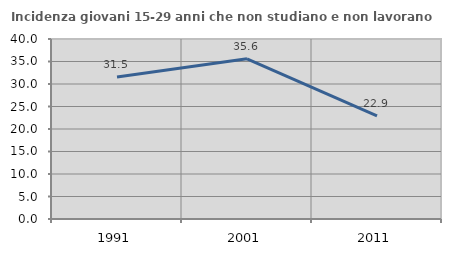
| Category | Incidenza giovani 15-29 anni che non studiano e non lavorano  |
|---|---|
| 1991.0 | 31.535 |
| 2001.0 | 35.61 |
| 2011.0 | 22.904 |